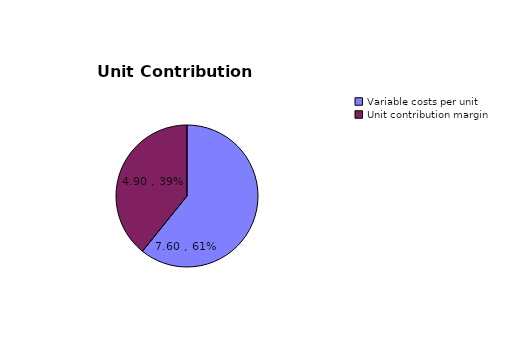
| Category | Series 0 |
|---|---|
| Variable costs per unit | 7.6 |
| Unit contribution margin | 4.9 |